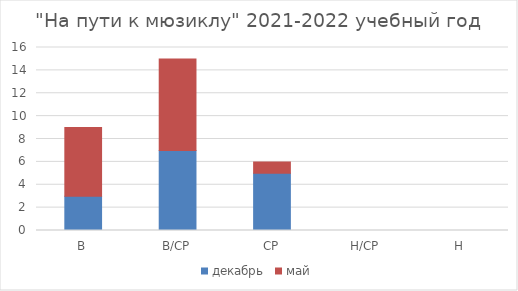
| Category | декабрь | май |
|---|---|---|
| В | 3 | 6 |
| В/СР | 7 | 8 |
| СР | 5 | 1 |
| Н/СР | 0 | 0 |
| Н | 0 | 0 |